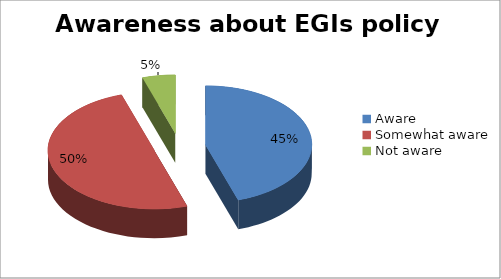
| Category | Series 0 |
|---|---|
| Aware  | 9 |
| Somewhat aware | 10 |
| Not aware | 1 |